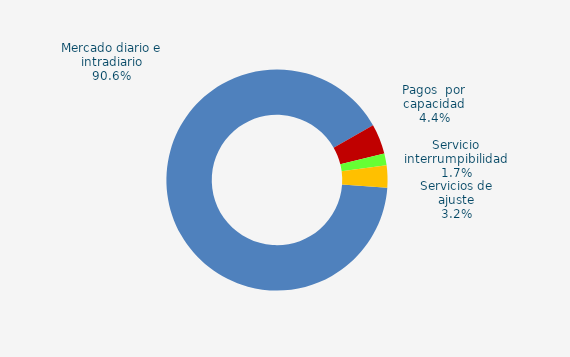
| Category | Series 0 |
|---|---|
| Mercado diario e intradiario | 58.79 |
| Pagos  por capacidad | 2.85 |
| Servicio interrumpibilidad | 1.13 |
| Servicios de ajuste | 2.1 |